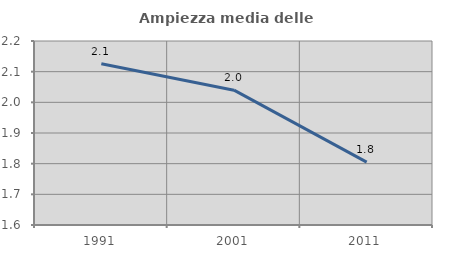
| Category | Ampiezza media delle famiglie |
|---|---|
| 1991.0 | 2.126 |
| 2001.0 | 2.04 |
| 2011.0 | 1.805 |